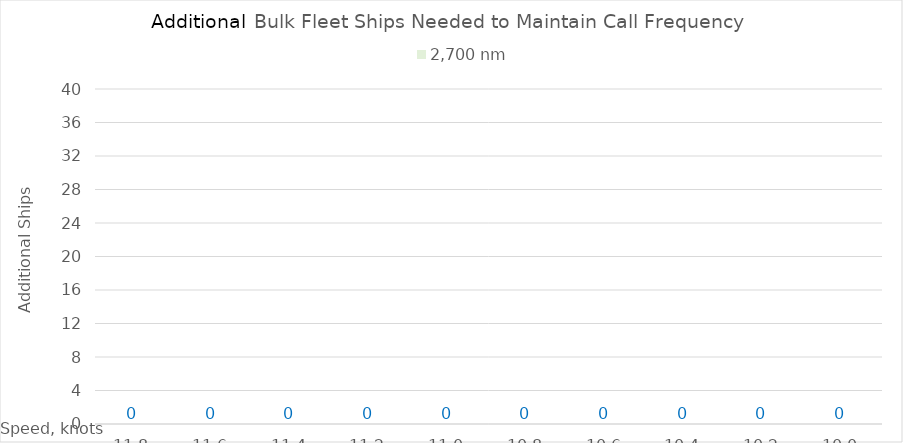
| Category | 2,700 |
|---|---|
| 11.8 | 0 |
| 11.600000000000001 | 0 |
| 11.400000000000002 | 0 |
| 11.200000000000003 | 0 |
| 11.000000000000004 | 0 |
| 10.800000000000004 | 0 |
| 10.600000000000005 | 0 |
| 10.400000000000006 | 0 |
| 10.200000000000006 | 0 |
| 10.000000000000007 | 0 |